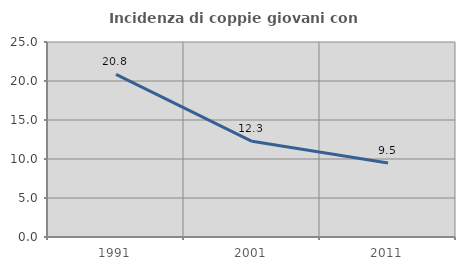
| Category | Incidenza di coppie giovani con figli |
|---|---|
| 1991.0 | 20.84 |
| 2001.0 | 12.264 |
| 2011.0 | 9.476 |